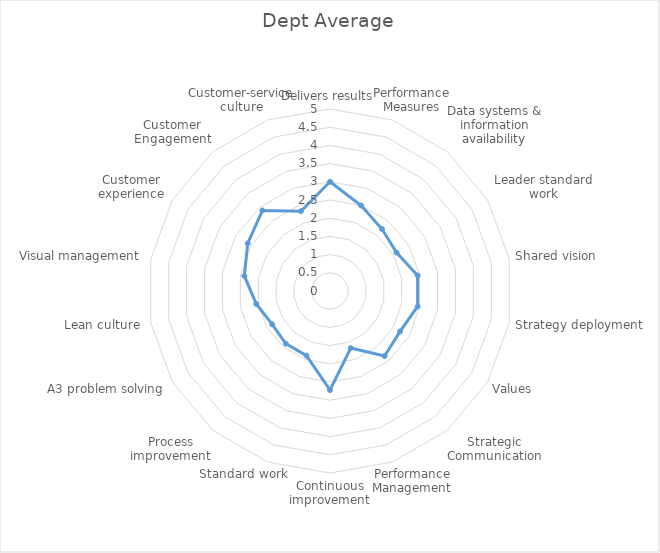
| Category | Dept Average |
|---|---|
| Delivers results | 3 |
| Performance Measures | 2.5 |
| Data systems & information availability | 2.222 |
| Leader standard work | 2.111 |
| Shared vision | 2.444 |
| Strategy deployment | 2.444 |
| Values | 2.222 |
| Strategic Communication | 2.333 |
| Performance Management | 1.667 |
| Continuous improvement | 2.722 |
| Standard work | 1.889 |
| Process improvement | 1.889 |
| A3 problem solving | 1.833 |
| Lean culture | 2.056 |
| Visual management | 2.389 |
| Customer experience | 2.611 |
| Customer Engagement | 2.889 |
| Customer-service culture | 2.333 |